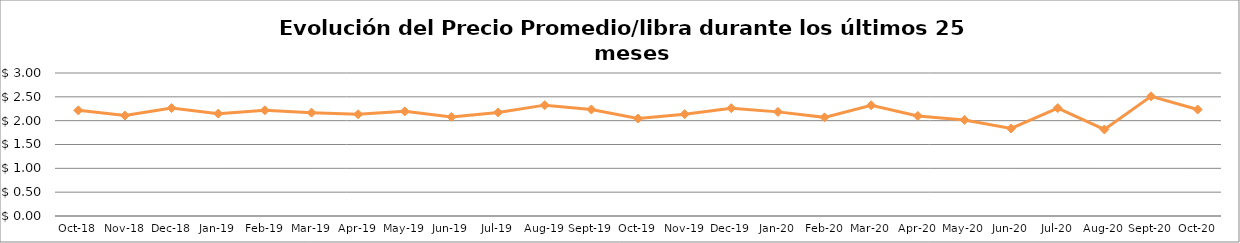
| Category | Series 0 |
|---|---|
| 2018-10-01 | 2.216 |
| 2018-11-01 | 2.106 |
| 2018-12-01 | 2.264 |
| 2019-01-01 | 2.147 |
| 2019-02-01 | 2.218 |
| 2019-03-01 | 2.169 |
| 2019-04-01 | 2.134 |
| 2019-05-01 | 2.195 |
| 2019-06-01 | 2.079 |
| 2019-07-01 | 2.173 |
| 2019-08-01 | 2.326 |
| 2019-09-01 | 2.234 |
| 2019-10-01 | 2.044 |
| 2019-11-01 | 2.137 |
| 2019-12-01 | 2.262 |
| 2020-01-01 | 2.185 |
| 2020-02-01 | 2.069 |
| 2020-03-01 | 2.323 |
| 2020-04-01 | 2.1 |
| 2020-05-01 | 2.016 |
| 2020-06-01 | 1.837 |
| 2020-07-01 | 2.265 |
| 2020-08-01 | 1.816 |
| 2020-09-01 | 2.511 |
| 2020-10-01 | 2.234 |